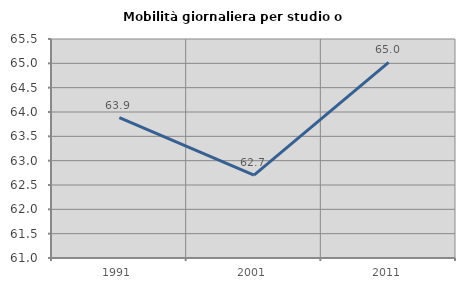
| Category | Mobilità giornaliera per studio o lavoro |
|---|---|
| 1991.0 | 63.882 |
| 2001.0 | 62.702 |
| 2011.0 | 65.021 |